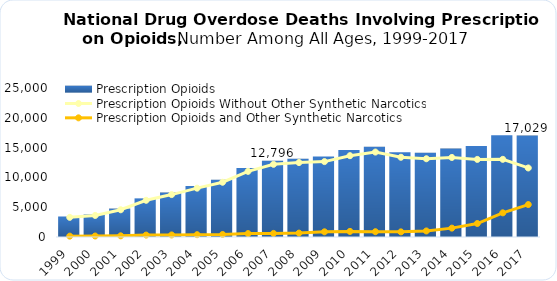
| Category | Prescription Opioids |
|---|---|
| 1999.0 | 3442 |
| 2000.0 | 3785 |
| 2001.0 | 4770 |
| 2002.0 | 6483 |
| 2003.0 | 7461 |
| 2004.0 | 8577 |
| 2005.0 | 9612 |
| 2006.0 | 11589 |
| 2007.0 | 12796 |
| 2008.0 | 13149 |
| 2009.0 | 13523 |
| 2010.0 | 14583 |
| 2011.0 | 15140 |
| 2012.0 | 14240 |
| 2013.0 | 14145 |
| 2014.0 | 14838 |
| 2015.0 | 15281 |
| 2016.0 | 17087 |
| 2017.0 | 17029 |